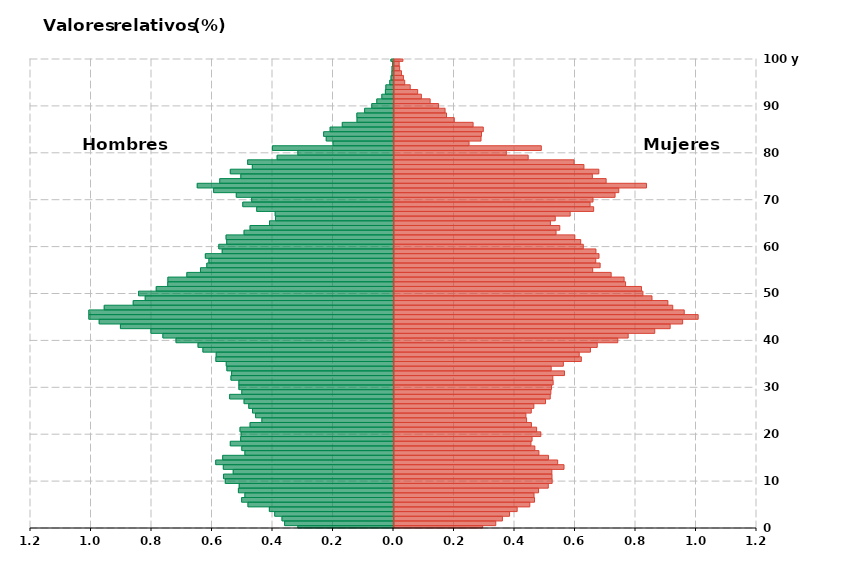
| Category | Hombres | Mujeres |
|---|---|---|
| 0 | -0.316 | 0.293 |
| 1 | -0.36 | 0.336 |
| 2 | -0.369 | 0.358 |
| 3 | -0.393 | 0.382 |
| 4 | -0.41 | 0.407 |
| 5 | -0.481 | 0.449 |
| 6 | -0.502 | 0.464 |
| 7 | -0.491 | 0.463 |
| 8 | -0.513 | 0.478 |
| 9 | -0.51 | 0.51 |
| 10 | -0.556 | 0.523 |
| 11 | -0.562 | 0.522 |
| 12 | -0.53 | 0.522 |
| 13 | -0.563 | 0.562 |
| 14 | -0.588 | 0.541 |
| 15 | -0.565 | 0.511 |
| 16 | -0.491 | 0.479 |
| 17 | -0.501 | 0.466 |
| 18 | -0.539 | 0.453 |
| 19 | -0.505 | 0.456 |
| 20 | -0.504 | 0.485 |
| 21 | -0.507 | 0.471 |
| 22 | -0.474 | 0.454 |
| 23 | -0.435 | 0.438 |
| 24 | -0.456 | 0.436 |
| 25 | -0.466 | 0.454 |
| 26 | -0.478 | 0.462 |
| 27 | -0.494 | 0.501 |
| 28 | -0.542 | 0.516 |
| 29 | -0.501 | 0.519 |
| 30 | -0.511 | 0.521 |
| 31 | -0.511 | 0.526 |
| 32 | -0.537 | 0.525 |
| 33 | -0.535 | 0.564 |
| 34 | -0.551 | 0.52 |
| 35 | -0.553 | 0.56 |
| 36 | -0.587 | 0.619 |
| 37 | -0.586 | 0.612 |
| 38 | -0.63 | 0.649 |
| 39 | -0.646 | 0.672 |
| 40 | -0.719 | 0.74 |
| 41 | -0.762 | 0.774 |
| 42 | -0.802 | 0.862 |
| 43 | -0.903 | 0.913 |
| 44 | -0.973 | 0.954 |
| 45 | -1.007 | 1.006 |
| 46 | -1.007 | 0.959 |
| 47 | -0.956 | 0.921 |
| 48 | -0.86 | 0.905 |
| 49 | -0.821 | 0.853 |
| 50 | -0.843 | 0.823 |
| 51 | -0.784 | 0.818 |
| 52 | -0.746 | 0.766 |
| 53 | -0.746 | 0.761 |
| 54 | -0.683 | 0.718 |
| 55 | -0.638 | 0.657 |
| 56 | -0.617 | 0.681 |
| 57 | -0.61 | 0.667 |
| 58 | -0.622 | 0.678 |
| 59 | -0.566 | 0.668 |
| 60 | -0.578 | 0.626 |
| 61 | -0.551 | 0.617 |
| 62 | -0.553 | 0.598 |
| 63 | -0.494 | 0.536 |
| 64 | -0.474 | 0.548 |
| 65 | -0.41 | 0.517 |
| 66 | -0.39 | 0.533 |
| 67 | -0.391 | 0.582 |
| 68 | -0.452 | 0.66 |
| 69 | -0.498 | 0.648 |
| 70 | -0.469 | 0.658 |
| 71 | -0.52 | 0.731 |
| 72 | -0.595 | 0.743 |
| 73 | -0.649 | 0.835 |
| 74 | -0.574 | 0.701 |
| 75 | -0.505 | 0.656 |
| 76 | -0.539 | 0.677 |
| 77 | -0.467 | 0.628 |
| 78 | -0.482 | 0.595 |
| 79 | -0.385 | 0.444 |
| 80 | -0.316 | 0.371 |
| 81 | -0.4 | 0.487 |
| 82 | -0.2 | 0.248 |
| 83 | -0.222 | 0.288 |
| 84 | -0.231 | 0.289 |
| 85 | -0.209 | 0.295 |
| 86 | -0.169 | 0.261 |
| 87 | -0.121 | 0.199 |
| 88 | -0.121 | 0.174 |
| 89 | -0.095 | 0.169 |
| 90 | -0.072 | 0.147 |
| 91 | -0.055 | 0.119 |
| 92 | -0.039 | 0.091 |
| 93 | -0.027 | 0.078 |
| 94 | -0.025 | 0.054 |
| 95 | -0.012 | 0.035 |
| 96 | -0.008 | 0.031 |
| 97 | -0.005 | 0.025 |
| 98 | -0.005 | 0.019 |
| 99 | -0.003 | 0.017 |
| 100 | -0.009 | 0.029 |